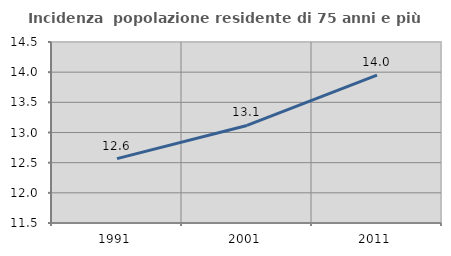
| Category | Incidenza  popolazione residente di 75 anni e più |
|---|---|
| 1991.0 | 12.568 |
| 2001.0 | 13.116 |
| 2011.0 | 13.951 |